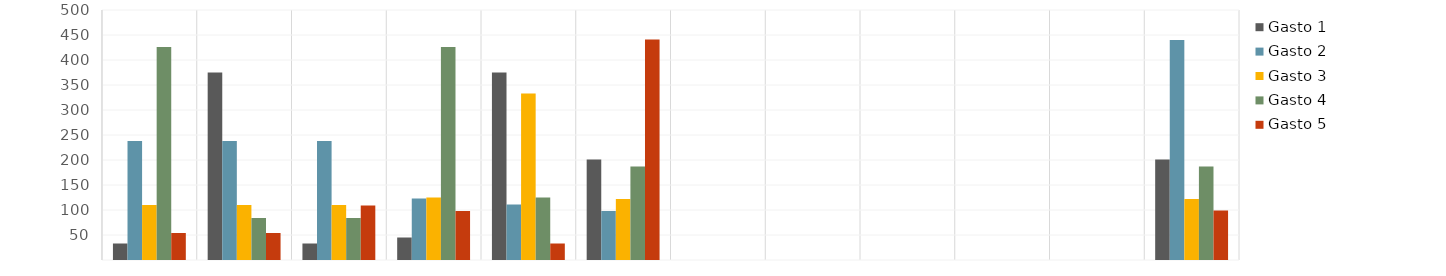
| Category | Gasto 1 | Gasto 2 | Gasto 3 | Gasto 4 | Gasto 5 |
|---|---|---|---|---|---|
| Ene | 33 | 238 | 110 | 426 | 54 |
| Feb | 375 | 238 | 110 | 84 | 54 |
| Mar | 33 | 238 | 110 | 84 | 109 |
| Abr | 45 | 123 | 125 | 426 | 98 |
| May | 375 | 111 | 333 | 125 | 33 |
| Jun | 201 | 98 | 122 | 187 | 441 |
| Jul | 0 | 0 | 0 | 0 | 0 |
| Ago | 0 | 0 | 0 | 0 | 0 |
| Sep | 0 | 0 | 0 | 0 | 0 |
| Oct | 0 | 0 | 0 | 0 | 0 |
| Nov | 0 | 0 | 0 | 0 | 0 |
| Dic | 201 | 440 | 122 | 187 | 99 |